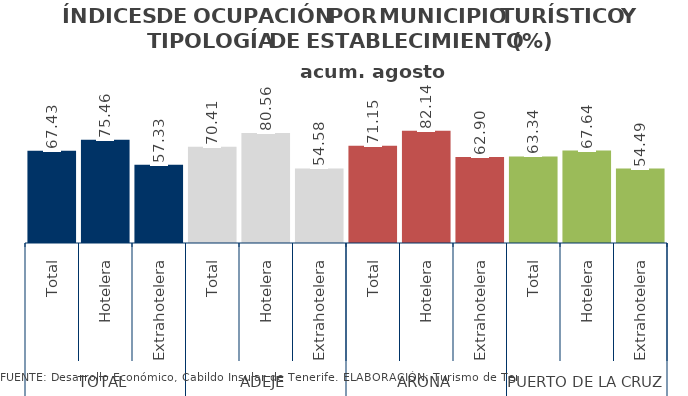
| Category | acum. agosto 2014 |
|---|---|
| 0 | 67.435 |
| 1 | 75.458 |
| 2 | 57.33 |
| 3 | 70.414 |
| 4 | 80.556 |
| 5 | 54.583 |
| 6 | 71.151 |
| 7 | 82.136 |
| 8 | 62.895 |
| 9 | 63.341 |
| 10 | 67.644 |
| 11 | 54.487 |